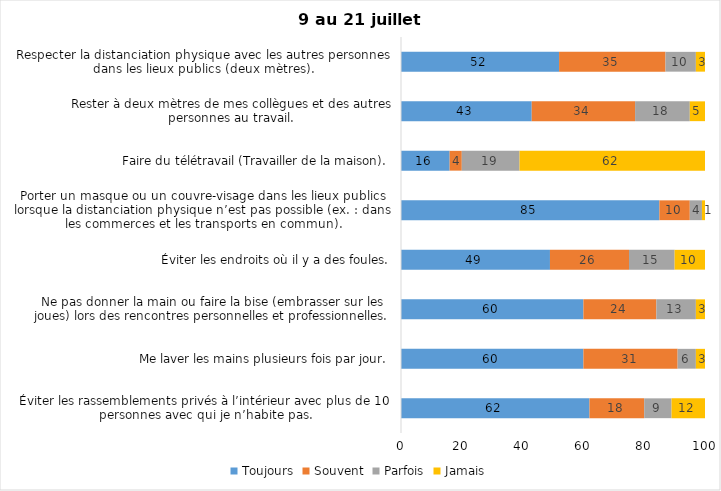
| Category | Toujours | Souvent | Parfois | Jamais |
|---|---|---|---|---|
| Éviter les rassemblements privés à l’intérieur avec plus de 10 personnes avec qui je n’habite pas. | 62 | 18 | 9 | 12 |
| Me laver les mains plusieurs fois par jour. | 60 | 31 | 6 | 3 |
| Ne pas donner la main ou faire la bise (embrasser sur les joues) lors des rencontres personnelles et professionnelles. | 60 | 24 | 13 | 3 |
| Éviter les endroits où il y a des foules. | 49 | 26 | 15 | 10 |
| Porter un masque ou un couvre-visage dans les lieux publics lorsque la distanciation physique n’est pas possible (ex. : dans les commerces et les transports en commun). | 85 | 10 | 4 | 1 |
| Faire du télétravail (Travailler de la maison). | 16 | 4 | 19 | 62 |
| Rester à deux mètres de mes collègues et des autres personnes au travail. | 43 | 34 | 18 | 5 |
| Respecter la distanciation physique avec les autres personnes dans les lieux publics (deux mètres). | 52 | 35 | 10 | 3 |